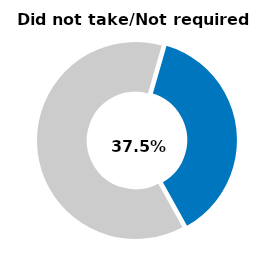
| Category | Series 0 |
|---|---|
| Did not take/not required | 0.375 |
| Other | 0.625 |